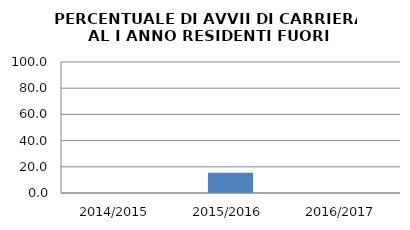
| Category | 2014/2015 2015/2016 2016/2017 |
|---|---|
| 2014/2015 | 0 |
| 2015/2016 | 15.385 |
| 2016/2017 | 0 |